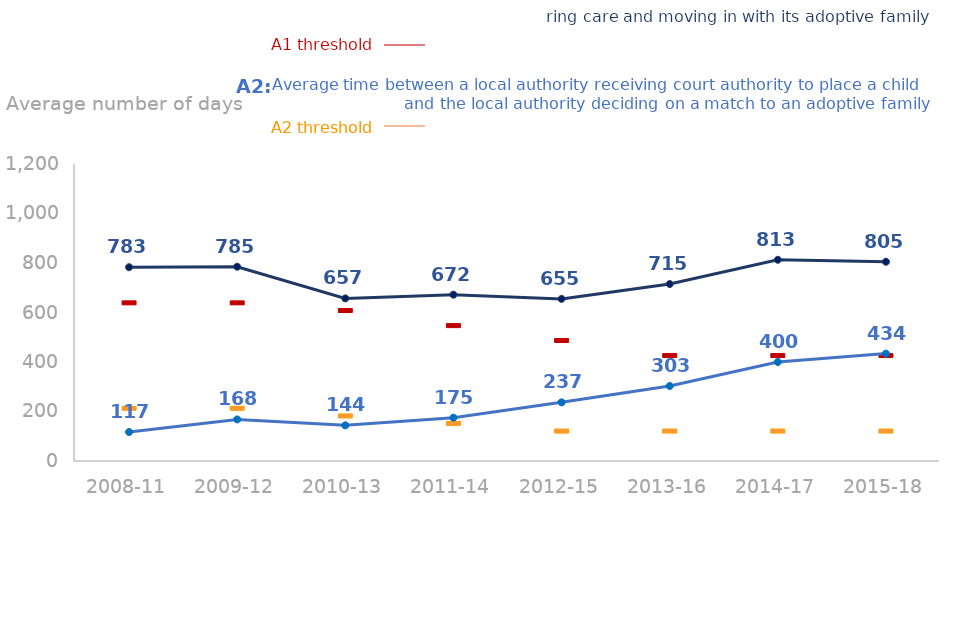
| Category | National threshold for average time from child entering care to moving in with its adoptive family | National threshold for average time from the LA receiving court authority to place a child and matching with adoptive family | Series 2 | Series 3 |
|---|---|---|---|---|
| 2008-11 | 639 | 213 | 783 | 117 |
| 2009-12 | 639 | 213 | 785 | 168 |
| 2010-13 | 608 | 182 | 657 | 144 |
| 2011-14 | 547 | 152 | 672 | 175 |
| 2012-15 | 487 | 121 | 655 | 237 |
| 2013-16 | 426 | 121 | 715 | 303 |
| 2014-17 | 426 | 121 | 813 | 400 |
| 2015-18 | 426 | 121 | 805 | 434 |